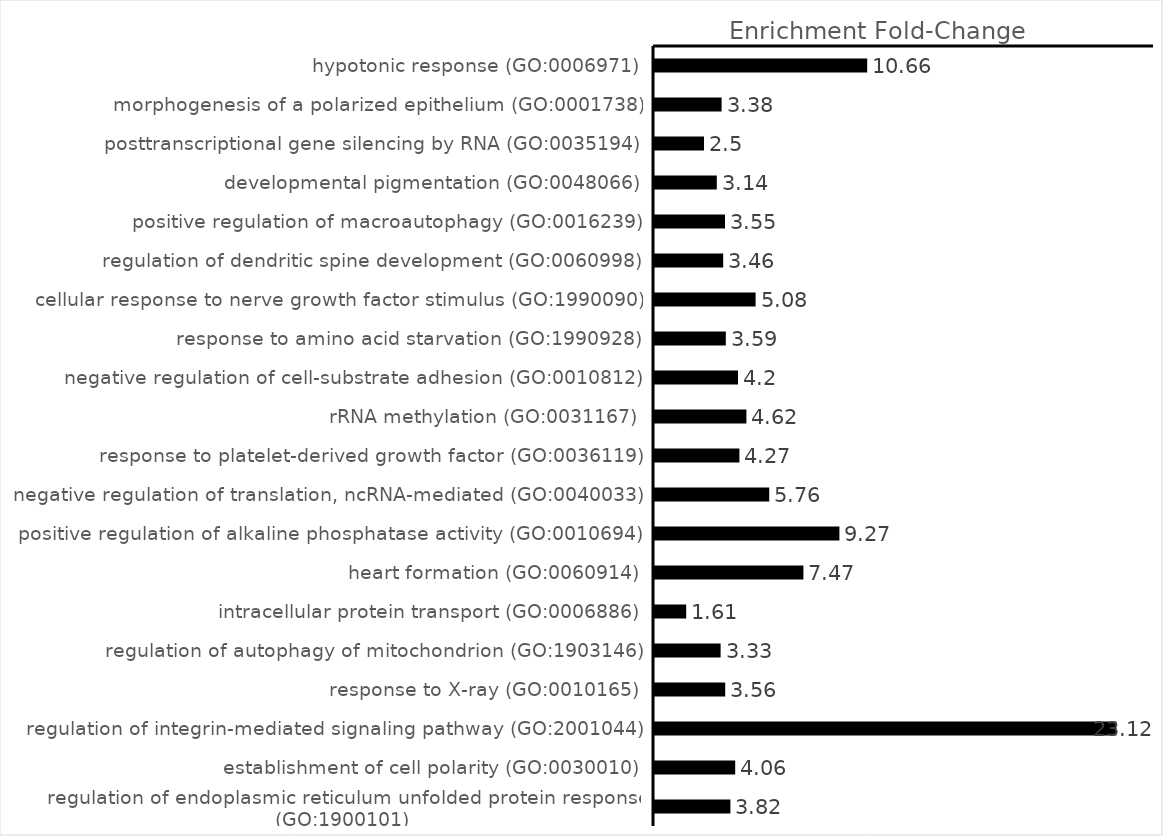
| Category | Enrichment Fold-Change |
|---|---|
| hypotonic response (GO:0006971) | 10.66 |
| morphogenesis of a polarized epithelium (GO:0001738) | 3.38 |
| posttranscriptional gene silencing by RNA (GO:0035194) | 2.5 |
| developmental pigmentation (GO:0048066) | 3.14 |
| positive regulation of macroautophagy (GO:0016239) | 3.55 |
| regulation of dendritic spine development (GO:0060998) | 3.46 |
| cellular response to nerve growth factor stimulus (GO:1990090) | 5.08 |
| response to amino acid starvation (GO:1990928) | 3.59 |
| negative regulation of cell-substrate adhesion (GO:0010812) | 4.2 |
| rRNA methylation (GO:0031167) | 4.62 |
| response to platelet-derived growth factor (GO:0036119) | 4.27 |
| negative regulation of translation, ncRNA-mediated (GO:0040033) | 5.76 |
| positive regulation of alkaline phosphatase activity (GO:0010694) | 9.27 |
| heart formation (GO:0060914) | 7.47 |
| intracellular protein transport (GO:0006886) | 1.61 |
| regulation of autophagy of mitochondrion (GO:1903146) | 3.33 |
| response to X-ray (GO:0010165) | 3.56 |
| regulation of integrin-mediated signaling pathway (GO:2001044) | 23.12 |
| establishment of cell polarity (GO:0030010) | 4.06 |
| regulation of endoplasmic reticulum unfolded protein response (GO:1900101) | 3.82 |